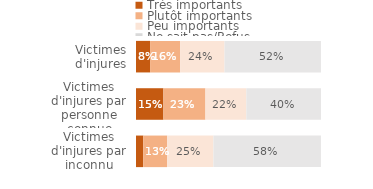
| Category | Très importants | Plutôt importants | Peu importants | Pas importants | Ne sait pas/Refus |
|---|---|---|---|---|---|
| Victimes d'injures par inconnu | 0.039 | 0.129 | 0.25 | 0.581 | 0 |
| Victimes d'injures par personne connue | 0.148 | 0.227 | 0.221 | 0.404 | 0 |
| Victimes d'injures | 0.076 | 0.162 | 0.24 | 0.521 | 0 |